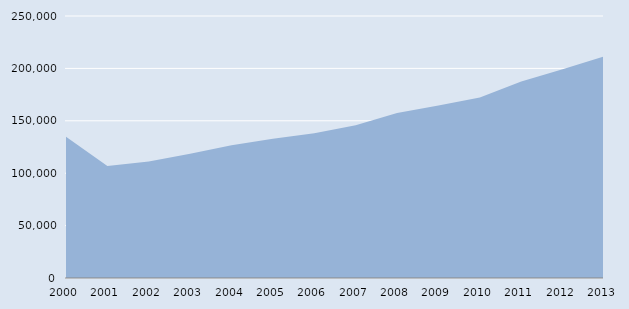
| Category | Series 0 |
|---|---|
| 2000.0 | 134675 |
| 2001.0 | 106828 |
| 2002.0 | 111106 |
| 2003.0 | 118521 |
| 2004.0 | 126789 |
| 2005.0 | 132872 |
| 2006.0 | 138065 |
| 2007.0 | 145736 |
| 2008.0 | 157455 |
| 2009.0 | 164691 |
| 2010.0 | 172274 |
| 2011.0 | 187409 |
| 2012.0 | 199209 |
| 2013.0 | 211451 |